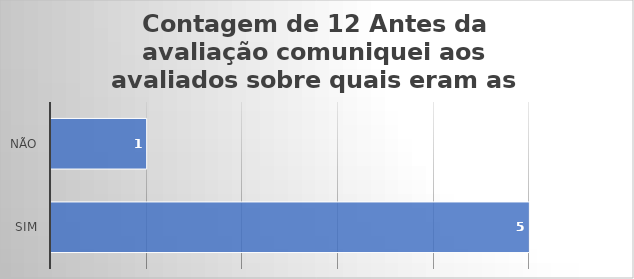
| Category | Contagem de 12 Antes da avaliação comuniquei aos avaliados sobre quais eram as metas? |
|---|---|
| Sim | 5 |
| Não | 1 |